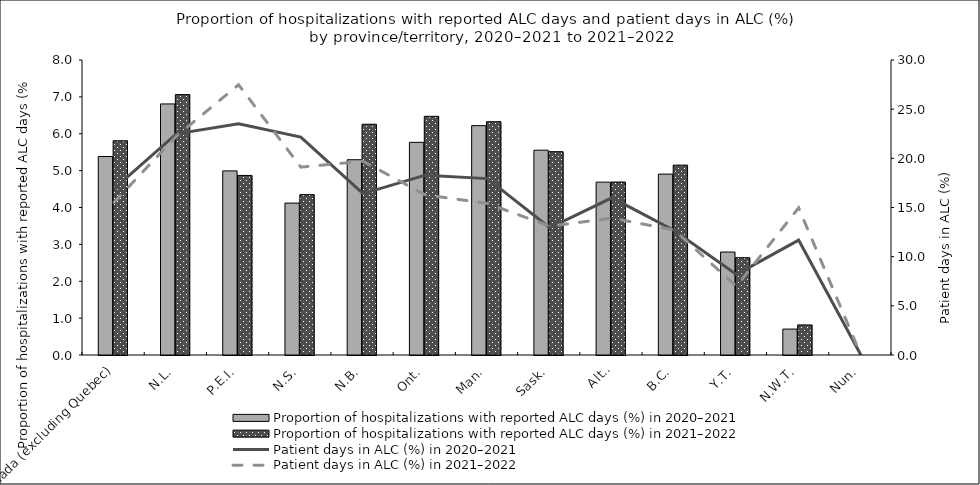
| Category | Proportion of hospitalizations with reported ALC days (%) in 2020–2021 | Proportion of hospitalizations with reported ALC days (%) in 2021–2022 |
|---|---|---|
| Canada (excluding Quebec) | 5.382 | 5.81 |
| N.L. | 6.809 | 7.062 |
| P.E.I. | 4.993 | 4.87 |
| N.S. | 4.12 | 4.349 |
| N.B. | 5.295 | 6.258 |
| Ont. | 5.767 | 6.472 |
| Man. | 6.22 | 6.326 |
| Sask. | 5.554 | 5.514 |
| Alta. | 4.688 | 4.691 |
| B.C. | 4.905 | 5.149 |
| Y.T. | 2.792 | 2.638 |
| N.W.T. | 0.703 | 0.816 |
| Nun. | 0 | 0 |